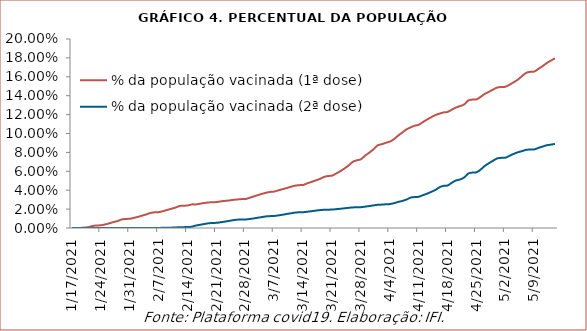
| Category | % da população vacinada (1ª dose) | % da população vacinada (2ª dose) |
|---|---|---|
| 1/17/21 | 0 | 0 |
| 1/18/21 | 0 | 0 |
| 1/19/21 | 0 | 0 |
| 1/20/21 | 0 | 0 |
| 1/21/21 | 0.001 | 0 |
| 1/22/21 | 0.002 | 0 |
| 1/23/21 | 0.003 | 0 |
| 1/24/21 | 0.003 | 0 |
| 1/25/21 | 0.004 | 0 |
| 1/26/21 | 0.005 | 0 |
| 1/27/21 | 0.006 | 0 |
| 1/28/21 | 0.007 | 0 |
| 1/29/21 | 0.009 | 0 |
| 1/30/21 | 0.01 | 0 |
| 1/31/21 | 0.01 | 0 |
| 2/1/21 | 0.011 | 0 |
| 2/2/21 | 0.012 | 0 |
| 2/3/21 | 0.013 | 0 |
| 2/4/21 | 0.014 | 0 |
| 2/5/21 | 0.016 | 0 |
| 2/6/21 | 0.017 | 0 |
| 2/7/21 | 0.017 | 0 |
| 2/8/21 | 0.018 | 0 |
| 2/9/21 | 0.019 | 0 |
| 2/10/21 | 0.02 | 0 |
| 2/11/21 | 0.021 | 0.001 |
| 2/12/21 | 0.023 | 0.001 |
| 2/13/21 | 0.024 | 0.001 |
| 2/14/21 | 0.024 | 0.001 |
| 2/15/21 | 0.025 | 0.001 |
| 2/16/21 | 0.025 | 0.003 |
| 2/17/21 | 0.026 | 0.003 |
| 2/18/21 | 0.026 | 0.004 |
| 2/19/21 | 0.027 | 0.005 |
| 2/20/21 | 0.027 | 0.005 |
| 2/21/21 | 0.027 | 0.005 |
| 2/22/21 | 0.028 | 0.006 |
| 2/23/21 | 0.029 | 0.007 |
| 2/24/21 | 0.029 | 0.007 |
| 2/25/21 | 0.03 | 0.008 |
| 2/26/21 | 0.03 | 0.009 |
| 2/27/21 | 0.031 | 0.009 |
| 2/28/21 | 0.031 | 0.009 |
| 3/1/21 | 0.032 | 0.01 |
| 3/2/21 | 0.033 | 0.01 |
| 3/3/21 | 0.035 | 0.011 |
| 3/4/21 | 0.036 | 0.012 |
| 3/5/21 | 0.037 | 0.012 |
| 3/6/21 | 0.038 | 0.013 |
| 3/7/21 | 0.039 | 0.013 |
| 3/8/21 | 0.04 | 0.013 |
| 3/9/21 | 0.041 | 0.014 |
| 3/10/21 | 0.042 | 0.015 |
| 3/11/21 | 0.044 | 0.016 |
| 3/12/21 | 0.045 | 0.016 |
| 3/13/21 | 0.045 | 0.017 |
| 3/14/21 | 0.046 | 0.017 |
| 3/15/21 | 0.047 | 0.017 |
| 3/16/21 | 0.049 | 0.018 |
| 3/17/21 | 0.05 | 0.018 |
| 3/18/21 | 0.052 | 0.019 |
| 3/19/21 | 0.054 | 0.019 |
| 3/20/21 | 0.055 | 0.019 |
| 3/21/21 | 0.055 | 0.02 |
| 3/22/21 | 0.058 | 0.02 |
| 3/23/21 | 0.06 | 0.02 |
| 3/24/21 | 0.063 | 0.021 |
| 3/25/21 | 0.066 | 0.021 |
| 3/26/21 | 0.07 | 0.022 |
| 3/27/21 | 0.072 | 0.022 |
| 3/28/21 | 0.073 | 0.022 |
| 3/29/21 | 0.077 | 0.023 |
| 3/30/21 | 0.08 | 0.023 |
| 3/31/21 | 0.083 | 0.024 |
| 4/1/21 | 0.087 | 0.025 |
| 4/2/21 | 0.089 | 0.025 |
| 4/3/21 | 0.09 | 0.025 |
| 4/4/21 | 0.091 | 0.025 |
| 4/5/21 | 0.094 | 0.026 |
| 4/6/21 | 0.098 | 0.028 |
| 4/7/21 | 0.101 | 0.029 |
| 4/8/21 | 0.104 | 0.03 |
| 4/9/21 | 0.106 | 0.032 |
| 4/10/21 | 0.108 | 0.033 |
| 4/11/21 | 0.109 | 0.033 |
| 4/12/21 | 0.112 | 0.035 |
| 4/13/21 | 0.115 | 0.036 |
| 4/14/21 | 0.117 | 0.038 |
| 4/15/21 | 0.119 | 0.04 |
| 4/16/21 | 0.121 | 0.043 |
| 4/17/21 | 0.122 | 0.045 |
| 4/18/21 | 0.123 | 0.045 |
| 4/19/21 | 0.125 | 0.048 |
| 4/20/21 | 0.127 | 0.05 |
| 4/21/21 | 0.129 | 0.051 |
| 4/22/21 | 0.131 | 0.053 |
| 4/23/21 | 0.135 | 0.058 |
| 4/24/21 | 0.136 | 0.059 |
| 4/25/21 | 0.136 | 0.059 |
| 4/26/21 | 0.139 | 0.062 |
| 4/27/21 | 0.142 | 0.066 |
| 4/28/21 | 0.144 | 0.069 |
| 4/29/21 | 0.146 | 0.071 |
| 4/30/21 | 0.149 | 0.074 |
| 5/1/21 | 0.149 | 0.074 |
| 5/2/21 | 0.149 | 0.074 |
| 5/3/21 | 0.152 | 0.076 |
| 5/4/21 | 0.154 | 0.078 |
| 5/5/21 | 0.157 | 0.08 |
| 5/6/21 | 0.161 | 0.081 |
| 5/7/21 | 0.164 | 0.083 |
| 5/8/21 | 0.165 | 0.083 |
| 5/9/21 | 0.166 | 0.083 |
| 5/10/21 | 0.168 | 0.085 |
| 5/11/21 | 0.171 | 0.086 |
| 5/12/21 | 0.175 | 0.088 |
| 5/13/21 | 0.177 | 0.088 |
| 5/14/21 | 0.18 | 0.089 |